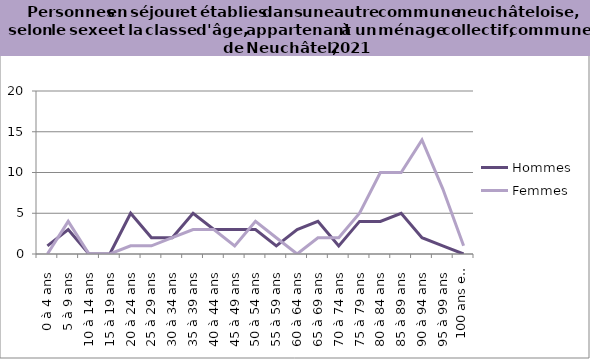
| Category | Hommes | Femmes |
|---|---|---|
| 0 à 4 ans | 1 | 0 |
| 5 à 9 ans | 3 | 4 |
| 10 à 14 ans | 0 | 0 |
| 15 à 19 ans | 0 | 0 |
| 20 à 24 ans | 5 | 1 |
| 25 à 29 ans | 2 | 1 |
| 30 à 34 ans | 2 | 2 |
| 35 à 39 ans | 5 | 3 |
| 40 à 44 ans | 3 | 3 |
| 45 à 49 ans | 3 | 1 |
| 50 à 54 ans | 3 | 4 |
| 55 à 59 ans | 1 | 2 |
| 60 à 64 ans | 3 | 0 |
| 65 à 69 ans | 4 | 2 |
| 70 à 74 ans | 1 | 2 |
| 75 à 79 ans | 4 | 5 |
| 80 à 84 ans | 4 | 10 |
| 85 à 89 ans | 5 | 10 |
| 90 à 94 ans | 2 | 14 |
| 95 à 99 ans | 1 | 8 |
| 100 ans et plus | 0 | 1 |